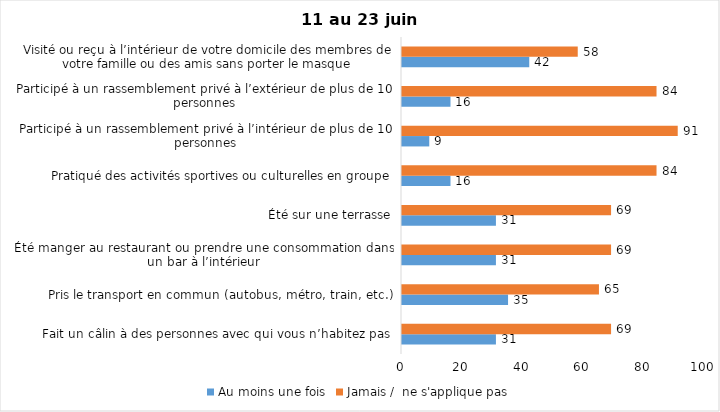
| Category | Au moins une fois | Jamais /  ne s'applique pas |
|---|---|---|
| Fait un câlin à des personnes avec qui vous n’habitez pas | 31 | 69 |
| Pris le transport en commun (autobus, métro, train, etc.) | 35 | 65 |
| Été manger au restaurant ou prendre une consommation dans un bar à l’intérieur | 31 | 69 |
| Été sur une terrasse | 31 | 69 |
| Pratiqué des activités sportives ou culturelles en groupe | 16 | 84 |
| Participé à un rassemblement privé à l’intérieur de plus de 10 personnes | 9 | 91 |
| Participé à un rassemblement privé à l’extérieur de plus de 10 personnes | 16 | 84 |
| Visité ou reçu à l’intérieur de votre domicile des membres de votre famille ou des amis sans porter le masque | 42 | 58 |